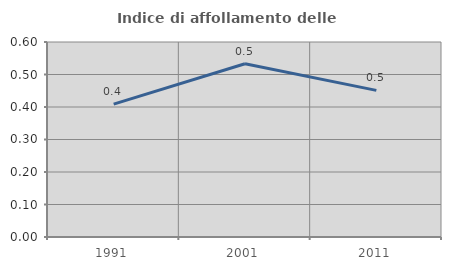
| Category | Indice di affollamento delle abitazioni  |
|---|---|
| 1991.0 | 0.409 |
| 2001.0 | 0.533 |
| 2011.0 | 0.451 |